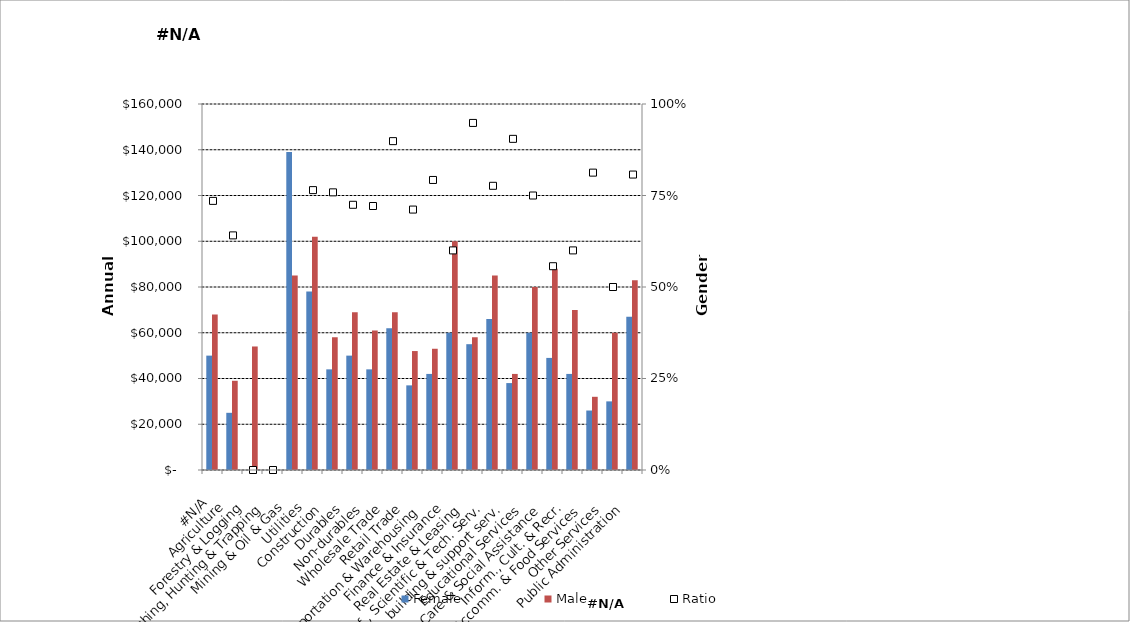
| Category | Female | Male |
|---|---|---|
|  #N/A  | 50000 | 68000 |
|  Agriculture   | 25000 | 39000 |
|  Forestry & Logging  | 0 | 54000 |
|  Fishing, Hunting & Trapping   | 0 | 0 |
|  Mining & Oil & Gas  | 139000 | 85000 |
|  Utilities   | 78000 | 102000 |
|  Construction   | 44000 | 58000 |
|  Durables   | 50000 | 69000 |
|  Non-durables   | 44000 | 61000 |
|  Wholesale Trade   | 62000 | 69000 |
|  Retail Trade   | 37000 | 52000 |
|  Transportation & Warehousing   | 42000 | 53000 |
|  Finance & Insurance   | 60000 | 100000 |
|  Real Estate & Leasing   | 55000 | 58000 |
|  Prof., Scientific & Tech. Serv.  | 66000 | 85000 |
|  Bus., building & support serv.  | 38000 | 42000 |
|  Educational Services   | 60000 | 80000 |
|  Health Care & Social Assistance   | 49000 | 88000 |
|  Inform., Cult. & Recr.  | 42000 | 70000 |
|  Accomm. & Food Services   | 26000 | 32000 |
|  Other Services   | 30000 | 60000 |
|  Public Administration   | 67000 | 83000 |